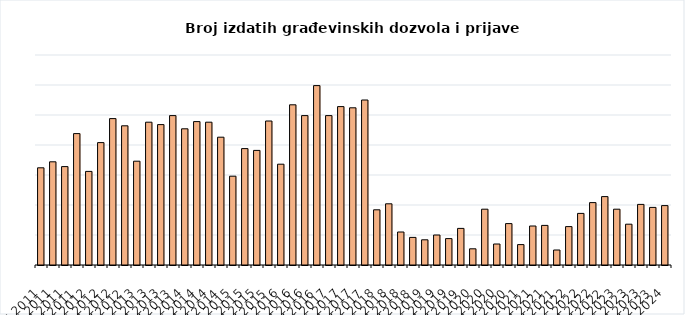
| Category | Broj izdatih građevinskih dozvola i prijava radova |
|---|---|
| I 2011 | 162 |
| II 2011 | 172 |
| III 2011 | 164 |
| IV 2011 | 219 |
| I 2012 | 156 |
| II 2012 | 204 |
| III 2012 | 244 |
| IV 2012 | 232 |
| I 2013 | 173 |
| II 2013 | 238 |
| III 2013 | 234 |
| IV 2013 | 249 |
| I 2014 | 227 |
| II 2014 | 239 |
| III 2014 | 238 |
| IV 2014 | 213 |
| I 2015 | 148 |
| II 2015 | 194 |
| III 2015 | 191 |
| IV 2015 | 240 |
| I 2016 | 168 |
| II 2016 | 267 |
| III 2016 | 249 |
| IV 2016 | 299 |
| I 2017 | 249 |
| II 2017 | 264 |
| III 2017 | 262 |
| IV 2017 | 275 |
| I 2018 | 92 |
| II 2018 | 102 |
| III 2018 | 55 |
| IV 2018 | 46 |
| I 2019 | 42 |
| II 2019 | 50 |
| III 2019 | 44 |
| IV 2019 | 61 |
| I 2020 | 27 |
| II 2020 | 93 |
| III 2020 | 35 |
| IV 2020 | 69 |
| I 2021 | 34 |
| II 2021 | 65 |
| III 2021 | 66 |
| IV 2021 | 25 |
| I 2022 | 64 |
| II 2022 | 86 |
| III 2022 | 104 |
| IV 2022 | 114 |
| I 2023 | 93 |
| II 2023 | 68 |
| III 2023 | 101 |
| IV 2023 | 96 |
| I 2024 | 99 |